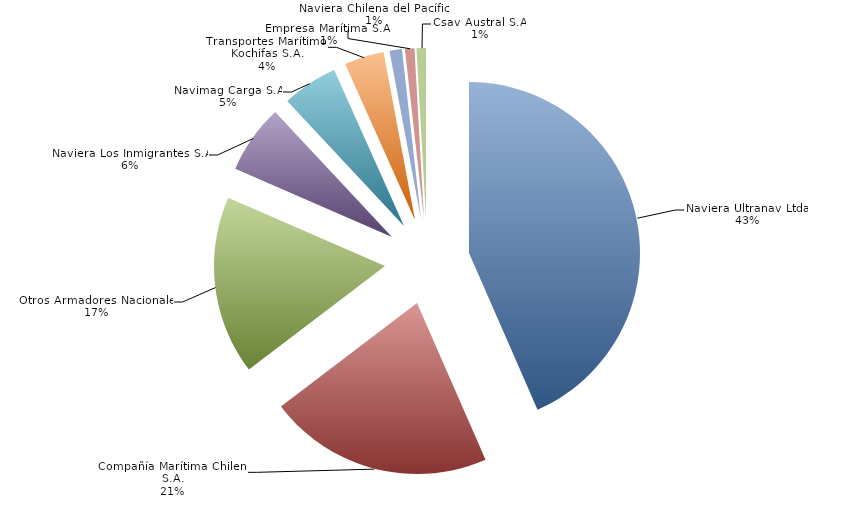
| Category | Series 0 |
|---|---|
| Naviera Ultranav Ltda. | 0.434 |
| Compañía Marítima Chilena S.A. | 0.212 |
| Otros Armadores Nacionales | 0.169 |
| Naviera Los Inmigrantes S.A. | 0.065 |
| Navimag Carga S.A. | 0.053 |
| Transportes Marítimos Kochifas S.A. | 0.037 |
| Empresa Marítima S.A.  | 0.012 |
| Naviera Chilena del Pacífico | 0.009 |
| Csav Austral S.A. | 0.009 |